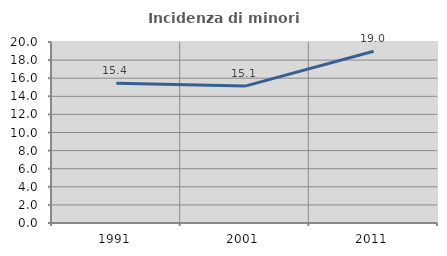
| Category | Incidenza di minori stranieri |
|---|---|
| 1991.0 | 15.447 |
| 2001.0 | 15.125 |
| 2011.0 | 18.977 |